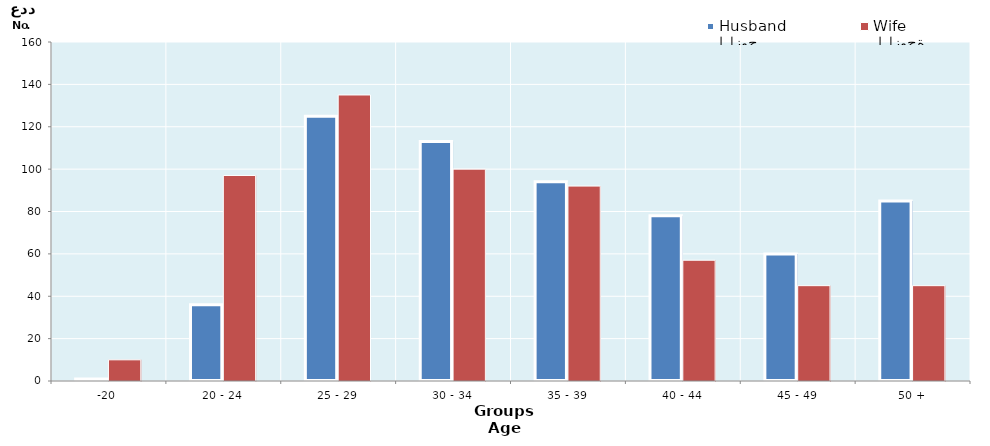
| Category | الزوج
Husband |  الزوجة
Wife |
|---|---|---|
| -20 | 1 | 10 |
| 20 - 24 | 36 | 97 |
| 25 - 29 | 125 | 135 |
| 30 - 34 | 113 | 100 |
| 35 - 39 | 94 | 92 |
| 40 - 44 | 78 | 57 |
| 45 - 49 | 60 | 45 |
| 50 + | 85 | 45 |